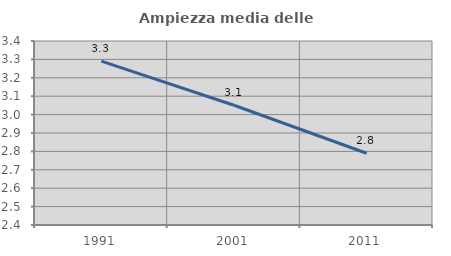
| Category | Ampiezza media delle famiglie |
|---|---|
| 1991.0 | 3.291 |
| 2001.0 | 3.051 |
| 2011.0 | 2.79 |